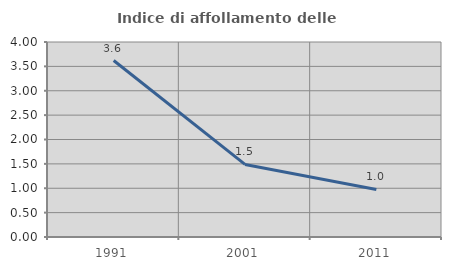
| Category | Indice di affollamento delle abitazioni  |
|---|---|
| 1991.0 | 3.62 |
| 2001.0 | 1.489 |
| 2011.0 | 0.976 |